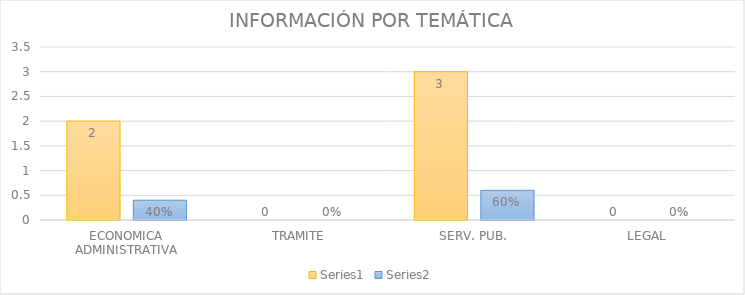
| Category | Series 3 | Series 4 |
|---|---|---|
| ECONOMICA ADMINISTRATIVA | 2 | 0.4 |
| TRAMITE | 0 | 0 |
| SERV. PUB. | 3 | 0.6 |
| LEGAL | 0 | 0 |